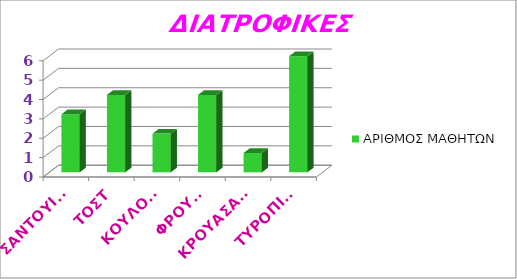
| Category | ΑΡΙΘΜΟΣ ΜΑΘΗΤΩΝ |
|---|---|
| ΣΑΝΤΟΥΙΤΣ | 3 |
| ΤΟΣΤ | 4 |
| ΚΟΥΛΟΥΡΙ | 2 |
| ΦΡΟΥΤΑ | 4 |
| ΚΡΟΥΑΣΑΝ  | 1 |
| ΤΥΡΟΠΙΤΑ | 6 |